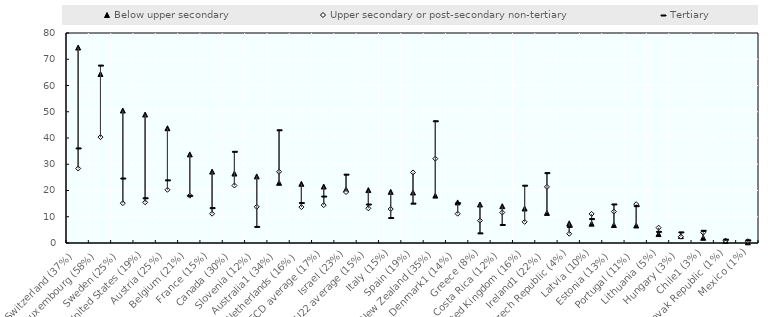
| Category | Below upper secondary | Upper secondary or post-secondary non-tertiary | Tertiary |
|---|---|---|---|
| Switzerland (37%) | 74.458 | 28.389 | 36.22 |
| Luxembourg (58%) | 64.389 | 40.331 | 67.773 |
| Sweden (25%) | 50.472 | 15.177 | 24.741 |
| United States (19%) | 48.945 | 15.505 | 17.229 |
| Austria (25%) | 43.715 | 20.277 | 24.051 |
| Belgium (21%) | 33.76 | 18.03 | 18.151 |
| France (15%) | 27.203 | 11.162 | 13.475 |
| Canada (30%) | 26.463 | 21.903 | 34.93 |
| Slovenia (12%) | 25.384 | 13.797 | 6.32 |
| Australia1 (34%) | 22.938 | 27.155 | 43.123 |
| Netherlands (16%) | 22.551 | 13.681 | 15.402 |
| OECD average (17%) | 21.51 | 14.436 | 17.877 |
| Israel (23%) | 20.402 | 19.409 | 26.223 |
| EU22 average (15%) | 20.163 | 13.215 | 14.845 |
| Italy (15%) | 19.499 | 12.942 | 9.71 |
| Spain (19%) | 19.24 | 26.881 | 15.179 |
| New Zealand (35%) | 18.058 | 32.121 | 46.57 |
| Denmark1 (14%) | 15.459 | 11.165 | 15.356 |
| Greece (8%) | 14.669 | 8.537 | 3.856 |
| Costa Rica (12%) | 14.034 | 11.616 | 7.056 |
| United Kingdom (16%) | 13.14 | 8.063 | 22.022 |
| Ireland1 (22%) | 11.467 | 21.369 | 26.804 |
| Czech Republic (4%) | 7.496 | 3.527 | 6.328 |
| Latvia (10%) | 7.38 | 11.089 | 9.303 |
| Estonia (13%) | 6.866 | 11.974 | 14.874 |
| Portugal (11%) | 6.683 | 14.775 | 14.216 |
| Lithuania (5%) | 3.402 | 5.843 | 4.435 |
| Hungary (3%) | 2.632 | 2.428 | 4.223 |
| Chile1 (3%) | 1.981 | 3.949 | 4.834 |
| Slovak Republic (1%) | 0.832 | 0.885 | 1.464 |
| Mexico (1%) | 0.26 | 0.667 | 1.206 |